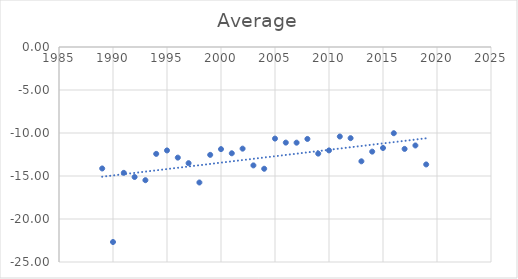
| Category | Average |
|---|---|
| 1989.0 | -14.125 |
| 1990.0 | -22.675 |
| 1991.0 | -14.633 |
| 1992.0 | -15.117 |
| 1993.0 | -15.488 |
| 1994.0 | -12.427 |
| 1995.0 | -12.027 |
| 1996.0 | -12.864 |
| 1997.0 | -13.508 |
| 1998.0 | -15.755 |
| 1999.0 | -12.542 |
| 2000.0 | -11.875 |
| 2001.0 | -12.358 |
| 2002.0 | -11.82 |
| 2003.0 | -13.767 |
| 2004.0 | -14.158 |
| 2005.0 | -10.65 |
| 2006.0 | -11.117 |
| 2007.0 | -11.125 |
| 2008.0 | -10.691 |
| 2009.0 | -12.4 |
| 2010.0 | -12.025 |
| 2011.0 | -10.408 |
| 2012.0 | -10.6 |
| 2013.0 | -13.292 |
| 2014.0 | -12.167 |
| 2015.0 | -11.742 |
| 2016.0 | -10.025 |
| 2017.0 | -11.85 |
| 2018.0 | -11.45 |
| 2019.0 | -13.657 |